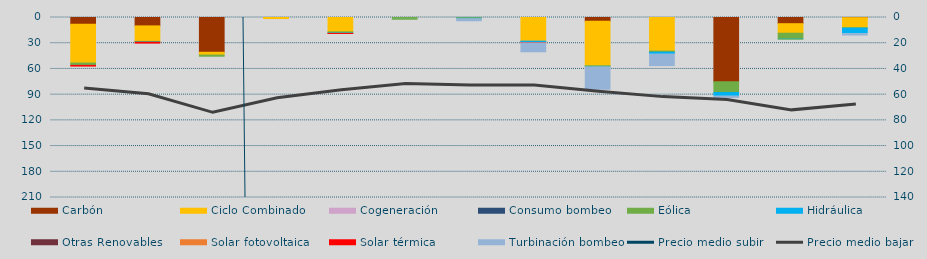
| Category | Carbón | Ciclo Combinado | Cogeneración | Consumo bombeo | Eólica | Hidráulica | Otras Renovables | Solar fotovoltaica | Solar térmica | Turbinación bombeo |
|---|---|---|---|---|---|---|---|---|---|---|
| 0 | 7913 | 45184 | 0 |  | 2732.2 | 54.3 |  | 0 | 784 | 0 |
| 1 | 9798 | 18106.5 | 0 |  | 568.3 | 428.4 |  | 0 | 944 | 0 |
| 2 | 40570 | 3247 | 0 |  | 1377.6 | 0 |  | 0 | 0 | 0 |
| 3 | 0 | 1230 | 0 |  | 0 | 0 |  | 0 | 0 | 0 |
| 4 | 0 | 16736 | 0 |  | 1262.8 | 563.7 |  | 25.9 | 0.7 | 0 |
| 5 | 0 | 0 | 0 |  | 2064.3 | 0 |  | 0 | 0 | 200 |
| 6 | 0 | 0 | 0 |  | 855.2 | 637 |  | 0 | 0 | 3504.5 |
| 7 | 0 | 27663.3 | 74 |  | 18.7 | 1645.3 |  | 8 | 221.4 | 11565.1 |
| 8 | 4460 | 52106 | 0 |  | 368.1 | 764.8 |  | 0 | 0 | 27154.6 |
| 9 | 0 | 39236 | 0 |  | 1278 | 2424.3 |  | 0 | 0 | 14379.6 |
| 10 | 74968 | 0 | 0 |  | 12523.3 | 4431 |  | 0 | 0 | 2491.6 |
| 11 | 7230 | 11115 | 0 |  | 6943.7 | 542.5 |  | 0 | 0 | 0 |
| 12 | 225 | 11910 | 0 |  | 141.3 | 6802.6 |  | 0 | 0 | 2517.5 |